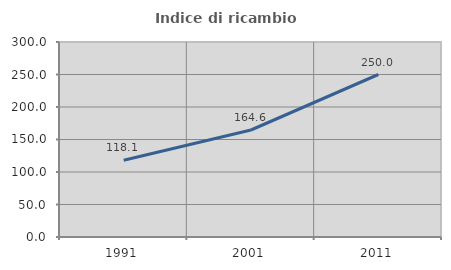
| Category | Indice di ricambio occupazionale  |
|---|---|
| 1991.0 | 118.085 |
| 2001.0 | 164.615 |
| 2011.0 | 250 |